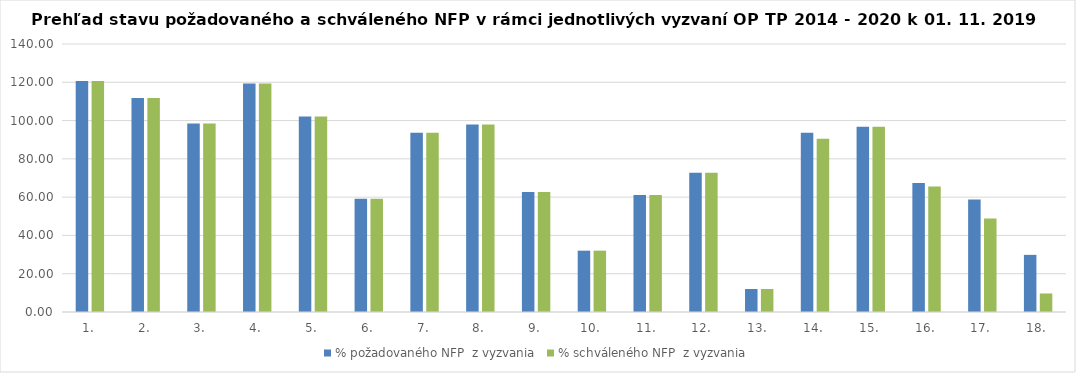
| Category | % požadovaného NFP  z vyzvania | % schváleného NFP  z vyzvania |
|---|---|---|
| 1. | 120.662 | 120.662 |
| 2. | 111.83 | 111.83 |
| 3. | 98.465 | 98.465 |
| 4. | 119.382 | 119.382 |
| 5. | 102.181 | 102.181 |
| 6. | 59.149 | 59.149 |
| 7. | 93.64 | 93.64 |
| 8. | 97.989 | 97.989 |
| 9. | 62.721 | 62.721 |
| 10. | 32.038 | 32.038 |
| 11. | 61.165 | 61.165 |
| 12. | 72.726 | 72.726 |
| 13. | 12.007 | 12.007 |
| 14. | 93.577 | 90.527 |
| 15. | 96.768 | 96.768 |
| 16. | 67.401 | 65.615 |
| 17. | 58.724 | 48.897 |
| 18. | 29.849 | 9.68 |